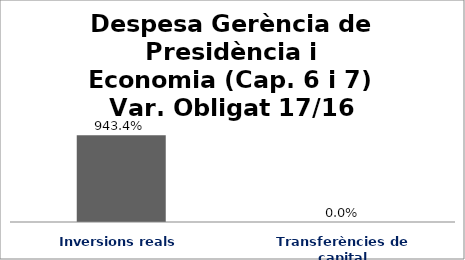
| Category | Series 0 |
|---|---|
| Inversions reals | 9.434 |
| Transferències de capital | 0 |